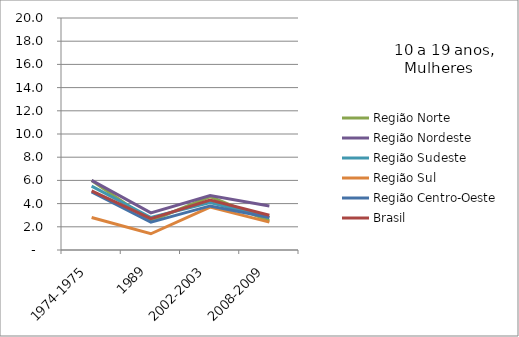
| Category | Região Norte | Região Nordeste | Região Sudeste | Região Sul | Região Centro-Oeste | Brasil |
|---|---|---|---|---|---|---|
| 1974-1975 | 6 | 6 | 5.5 | 2.8 | 5 | 5.1 |
| 1989 | 2.5 | 3.2 | 2.8 | 1.4 | 2.4 | 2.7 |
| 2002-2003 | 4.6 | 4.7 | 4.1 | 3.7 | 3.8 | 4.3 |
| 2008-2009 | 2.5 | 3.8 | 2.8 | 2.4 | 2.8 | 3 |